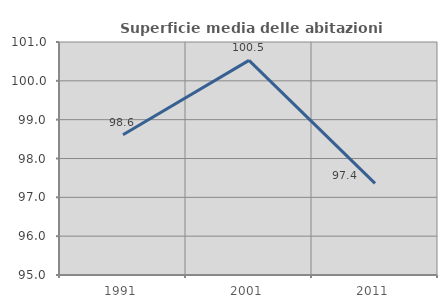
| Category | Superficie media delle abitazioni occupate |
|---|---|
| 1991.0 | 98.61 |
| 2001.0 | 100.528 |
| 2011.0 | 97.36 |